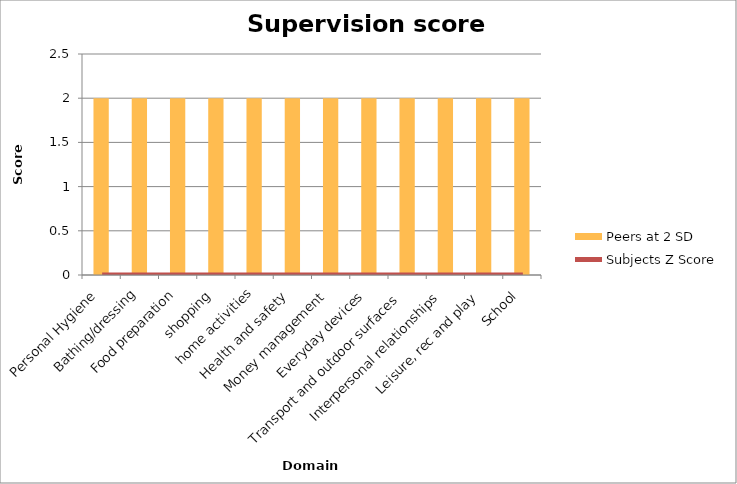
| Category | Peers at 2 SD |
|---|---|
| Personal Hygiene | 2 |
| Bathing/dressing | 2 |
| Food preparation | 2 |
| shopping | 2 |
| home activities | 2 |
| Health and safety | 2 |
| Money management | 2 |
| Everyday devices | 2 |
| Transport and outdoor surfaces | 2 |
| Interpersonal relationships | 2 |
| Leisure, rec and play | 2 |
| School | 2 |